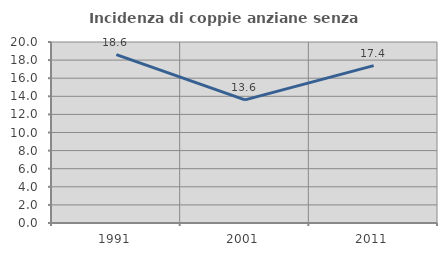
| Category | Incidenza di coppie anziane senza figli  |
|---|---|
| 1991.0 | 18.596 |
| 2001.0 | 13.605 |
| 2011.0 | 17.391 |